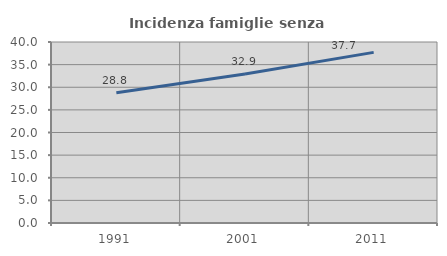
| Category | Incidenza famiglie senza nuclei |
|---|---|
| 1991.0 | 28.765 |
| 2001.0 | 32.932 |
| 2011.0 | 37.706 |